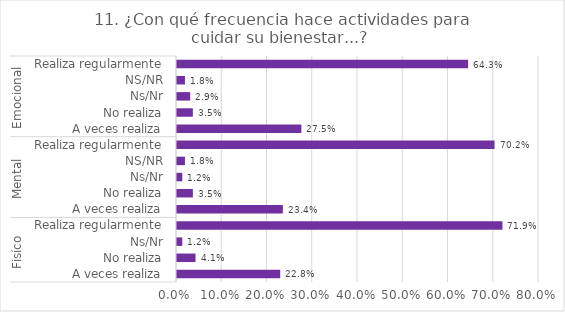
| Category | Series 0 |
|---|---|
| 0 | 0.228 |
| 1 | 0.041 |
| 2 | 0.012 |
| 3 | 0.719 |
| 4 | 0.234 |
| 5 | 0.035 |
| 6 | 0.012 |
| 7 | 0.018 |
| 8 | 0.702 |
| 9 | 0.275 |
| 10 | 0.035 |
| 11 | 0.029 |
| 12 | 0.018 |
| 13 | 0.643 |